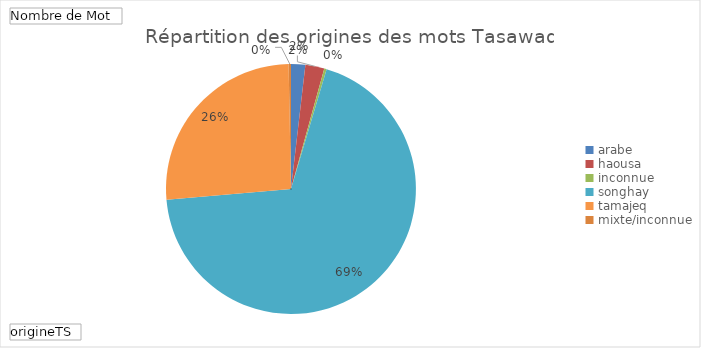
| Category | Total |
|---|---|
| arabe | 0.018 |
| haousa | 0.025 |
| inconnue | 0.003 |
| songhay | 0.69 |
| tamajeq | 0.261 |
| mixte/inconnue | 0.003 |